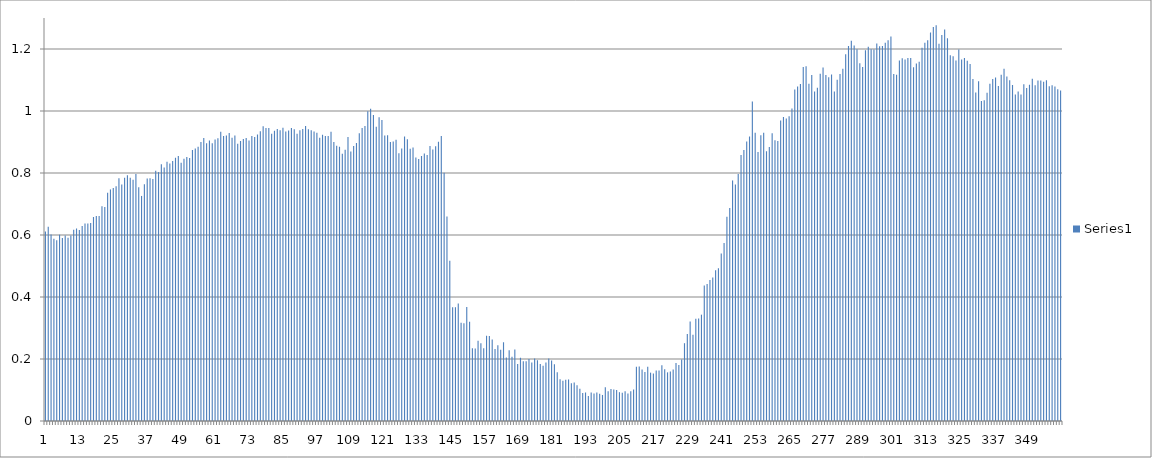
| Category | Series 0 |
|---|---|
| 0 | 0.611 |
| 1 | 0.627 |
| 2 | 0.602 |
| 3 | 0.588 |
| 4 | 0.583 |
| 5 | 0.601 |
| 6 | 0.59 |
| 7 | 0.598 |
| 8 | 0.591 |
| 9 | 0.598 |
| 10 | 0.617 |
| 11 | 0.621 |
| 12 | 0.616 |
| 13 | 0.629 |
| 14 | 0.637 |
| 15 | 0.637 |
| 16 | 0.639 |
| 17 | 0.658 |
| 18 | 0.661 |
| 19 | 0.661 |
| 20 | 0.693 |
| 21 | 0.69 |
| 22 | 0.736 |
| 23 | 0.747 |
| 24 | 0.752 |
| 25 | 0.757 |
| 26 | 0.783 |
| 27 | 0.763 |
| 28 | 0.785 |
| 29 | 0.793 |
| 30 | 0.785 |
| 31 | 0.778 |
| 32 | 0.797 |
| 33 | 0.754 |
| 34 | 0.726 |
| 35 | 0.764 |
| 36 | 0.782 |
| 37 | 0.783 |
| 38 | 0.781 |
| 39 | 0.807 |
| 40 | 0.803 |
| 41 | 0.828 |
| 42 | 0.818 |
| 43 | 0.836 |
| 44 | 0.831 |
| 45 | 0.839 |
| 46 | 0.849 |
| 47 | 0.855 |
| 48 | 0.833 |
| 49 | 0.846 |
| 50 | 0.852 |
| 51 | 0.848 |
| 52 | 0.874 |
| 53 | 0.879 |
| 54 | 0.885 |
| 55 | 0.9 |
| 56 | 0.913 |
| 57 | 0.896 |
| 58 | 0.905 |
| 59 | 0.896 |
| 60 | 0.908 |
| 61 | 0.912 |
| 62 | 0.933 |
| 63 | 0.919 |
| 64 | 0.921 |
| 65 | 0.929 |
| 66 | 0.914 |
| 67 | 0.921 |
| 68 | 0.894 |
| 69 | 0.903 |
| 70 | 0.91 |
| 71 | 0.913 |
| 72 | 0.905 |
| 73 | 0.919 |
| 74 | 0.916 |
| 75 | 0.924 |
| 76 | 0.935 |
| 77 | 0.951 |
| 78 | 0.945 |
| 79 | 0.945 |
| 80 | 0.927 |
| 81 | 0.936 |
| 82 | 0.942 |
| 83 | 0.938 |
| 84 | 0.946 |
| 85 | 0.934 |
| 86 | 0.937 |
| 87 | 0.945 |
| 88 | 0.941 |
| 89 | 0.927 |
| 90 | 0.938 |
| 91 | 0.942 |
| 92 | 0.952 |
| 93 | 0.941 |
| 94 | 0.938 |
| 95 | 0.934 |
| 96 | 0.93 |
| 97 | 0.914 |
| 98 | 0.923 |
| 99 | 0.919 |
| 100 | 0.919 |
| 101 | 0.933 |
| 102 | 0.9 |
| 103 | 0.888 |
| 104 | 0.885 |
| 105 | 0.862 |
| 106 | 0.875 |
| 107 | 0.916 |
| 108 | 0.869 |
| 109 | 0.887 |
| 110 | 0.897 |
| 111 | 0.928 |
| 112 | 0.945 |
| 113 | 0.952 |
| 114 | 0.999 |
| 115 | 1.007 |
| 116 | 0.987 |
| 117 | 0.949 |
| 118 | 0.98 |
| 119 | 0.971 |
| 120 | 0.921 |
| 121 | 0.922 |
| 122 | 0.9 |
| 123 | 0.902 |
| 124 | 0.907 |
| 125 | 0.864 |
| 126 | 0.879 |
| 127 | 0.918 |
| 128 | 0.909 |
| 129 | 0.878 |
| 130 | 0.882 |
| 131 | 0.85 |
| 132 | 0.845 |
| 133 | 0.855 |
| 134 | 0.863 |
| 135 | 0.858 |
| 136 | 0.887 |
| 137 | 0.876 |
| 138 | 0.886 |
| 139 | 0.901 |
| 140 | 0.919 |
| 141 | 0.801 |
| 142 | 0.66 |
| 143 | 0.517 |
| 144 | 0.367 |
| 145 | 0.367 |
| 146 | 0.379 |
| 147 | 0.317 |
| 148 | 0.315 |
| 149 | 0.368 |
| 150 | 0.32 |
| 151 | 0.235 |
| 152 | 0.234 |
| 153 | 0.259 |
| 154 | 0.251 |
| 155 | 0.235 |
| 156 | 0.275 |
| 157 | 0.274 |
| 158 | 0.263 |
| 159 | 0.232 |
| 160 | 0.244 |
| 161 | 0.23 |
| 162 | 0.254 |
| 163 | 0.205 |
| 164 | 0.228 |
| 165 | 0.207 |
| 166 | 0.231 |
| 167 | 0.184 |
| 168 | 0.204 |
| 169 | 0.193 |
| 170 | 0.193 |
| 171 | 0.2 |
| 172 | 0.189 |
| 173 | 0.202 |
| 174 | 0.196 |
| 175 | 0.184 |
| 176 | 0.178 |
| 177 | 0.189 |
| 178 | 0.202 |
| 179 | 0.195 |
| 180 | 0.183 |
| 181 | 0.157 |
| 182 | 0.135 |
| 183 | 0.13 |
| 184 | 0.133 |
| 185 | 0.134 |
| 186 | 0.122 |
| 187 | 0.124 |
| 188 | 0.115 |
| 189 | 0.104 |
| 190 | 0.09 |
| 191 | 0.092 |
| 192 | 0.081 |
| 193 | 0.092 |
| 194 | 0.089 |
| 195 | 0.092 |
| 196 | 0.088 |
| 197 | 0.084 |
| 198 | 0.109 |
| 199 | 0.096 |
| 200 | 0.103 |
| 201 | 0.102 |
| 202 | 0.1 |
| 203 | 0.093 |
| 204 | 0.091 |
| 205 | 0.096 |
| 206 | 0.089 |
| 207 | 0.096 |
| 208 | 0.102 |
| 209 | 0.175 |
| 210 | 0.176 |
| 211 | 0.166 |
| 212 | 0.158 |
| 213 | 0.175 |
| 214 | 0.156 |
| 215 | 0.153 |
| 216 | 0.163 |
| 217 | 0.163 |
| 218 | 0.18 |
| 219 | 0.167 |
| 220 | 0.157 |
| 221 | 0.16 |
| 222 | 0.166 |
| 223 | 0.187 |
| 224 | 0.181 |
| 225 | 0.198 |
| 226 | 0.251 |
| 227 | 0.281 |
| 228 | 0.321 |
| 229 | 0.278 |
| 230 | 0.33 |
| 231 | 0.331 |
| 232 | 0.343 |
| 233 | 0.437 |
| 234 | 0.442 |
| 235 | 0.455 |
| 236 | 0.463 |
| 237 | 0.486 |
| 238 | 0.493 |
| 239 | 0.54 |
| 240 | 0.574 |
| 241 | 0.659 |
| 242 | 0.687 |
| 243 | 0.776 |
| 244 | 0.763 |
| 245 | 0.797 |
| 246 | 0.858 |
| 247 | 0.874 |
| 248 | 0.902 |
| 249 | 0.918 |
| 250 | 1.031 |
| 251 | 0.93 |
| 252 | 0.868 |
| 253 | 0.922 |
| 254 | 0.93 |
| 255 | 0.87 |
| 256 | 0.884 |
| 257 | 0.928 |
| 258 | 0.906 |
| 259 | 0.903 |
| 260 | 0.969 |
| 261 | 0.981 |
| 262 | 0.976 |
| 263 | 0.983 |
| 264 | 1.008 |
| 265 | 1.069 |
| 266 | 1.079 |
| 267 | 1.087 |
| 268 | 1.142 |
| 269 | 1.144 |
| 270 | 1.088 |
| 271 | 1.116 |
| 272 | 1.063 |
| 273 | 1.075 |
| 274 | 1.12 |
| 275 | 1.14 |
| 276 | 1.116 |
| 277 | 1.109 |
| 278 | 1.118 |
| 279 | 1.063 |
| 280 | 1.101 |
| 281 | 1.119 |
| 282 | 1.136 |
| 283 | 1.183 |
| 284 | 1.21 |
| 285 | 1.227 |
| 286 | 1.211 |
| 287 | 1.199 |
| 288 | 1.154 |
| 289 | 1.142 |
| 290 | 1.196 |
| 291 | 1.207 |
| 292 | 1.199 |
| 293 | 1.198 |
| 294 | 1.218 |
| 295 | 1.209 |
| 296 | 1.21 |
| 297 | 1.22 |
| 298 | 1.228 |
| 299 | 1.24 |
| 300 | 1.119 |
| 301 | 1.117 |
| 302 | 1.163 |
| 303 | 1.17 |
| 304 | 1.166 |
| 305 | 1.171 |
| 306 | 1.171 |
| 307 | 1.141 |
| 308 | 1.153 |
| 309 | 1.159 |
| 310 | 1.204 |
| 311 | 1.22 |
| 312 | 1.228 |
| 313 | 1.253 |
| 314 | 1.271 |
| 315 | 1.277 |
| 316 | 1.217 |
| 317 | 1.245 |
| 318 | 1.263 |
| 319 | 1.235 |
| 320 | 1.18 |
| 321 | 1.177 |
| 322 | 1.163 |
| 323 | 1.198 |
| 324 | 1.166 |
| 325 | 1.171 |
| 326 | 1.162 |
| 327 | 1.152 |
| 328 | 1.103 |
| 329 | 1.06 |
| 330 | 1.096 |
| 331 | 1.032 |
| 332 | 1.035 |
| 333 | 1.059 |
| 334 | 1.088 |
| 335 | 1.103 |
| 336 | 1.108 |
| 337 | 1.081 |
| 338 | 1.117 |
| 339 | 1.136 |
| 340 | 1.111 |
| 341 | 1.099 |
| 342 | 1.084 |
| 343 | 1.053 |
| 344 | 1.063 |
| 345 | 1.053 |
| 346 | 1.086 |
| 347 | 1.074 |
| 348 | 1.085 |
| 349 | 1.104 |
| 350 | 1.083 |
| 351 | 1.098 |
| 352 | 1.098 |
| 353 | 1.094 |
| 354 | 1.099 |
| 355 | 1.08 |
| 356 | 1.083 |
| 357 | 1.079 |
| 358 | 1.07 |
| 359 | 1.066 |